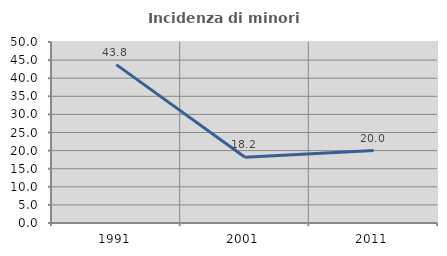
| Category | Incidenza di minori stranieri |
|---|---|
| 1991.0 | 43.75 |
| 2001.0 | 18.182 |
| 2011.0 | 20 |